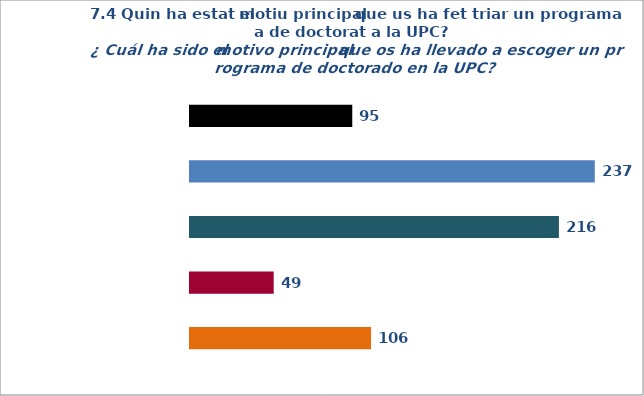
| Category | Series 0 |
|---|---|
| Unica unv | 95 |
| Ser titulat UPC | 237 |
| Prestigi UPC | 216 |
| Proximitat | 49 |
| Teballar Upc | 106 |